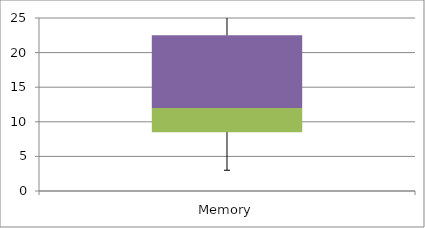
| Category | Min | Q1-Min | Med-Q1 | Q3-Med |
|---|---|---|---|---|
| Memory | 3 | 5.5 | 3.5 | 10.5 |